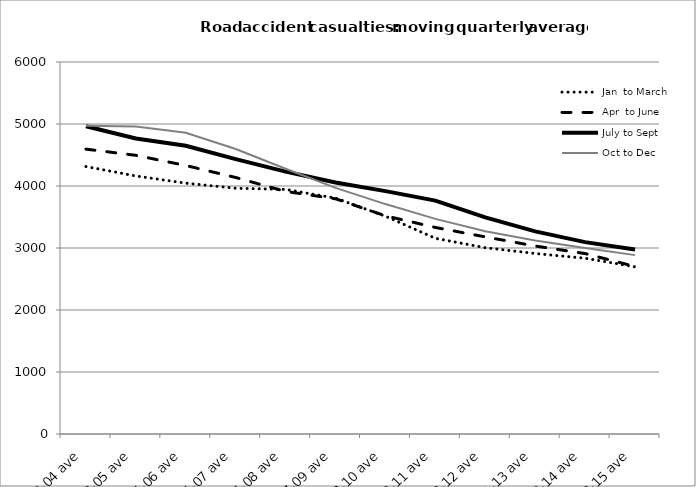
| Category | Jan  to March | Apr  to June | July to Sept | Oct to Dec |
|---|---|---|---|---|
| 2002-04 ave | 4314 | 4594.667 | 4963 | 4972.667 |
| 2003-05 ave | 4161.667 | 4494.667 | 4766 | 4958.667 |
| 2004-06 ave | 4046 | 4330.667 | 4648.667 | 4860 |
| 2005-07 ave | 3963.667 | 4137 | 4433 | 4597.333 |
| 2006-08 ave | 3945 | 3912.333 | 4231.667 | 4277.667 |
| 2007-09 ave | 3804.667 | 3793.667 | 4056.333 | 3970 |
| 2008-10 ave | 3512.667 | 3519 | 3917.667 | 3708.333 |
| 2009-11 ave | 3156.333 | 3331.333 | 3765 | 3469.667 |
| 2010-12 ave | 3004.333 | 3179.333 | 3493 | 3268.667 |
| 2011-13 ave | 2911.333 | 3032 | 3267.667 | 3122.333 |
| 2012-14 ave | 2835 | 2910 | 3094.333 | 3001 |
| 2013-15 ave | 2697 | 2701.667 | 2975.333 | 2885 |